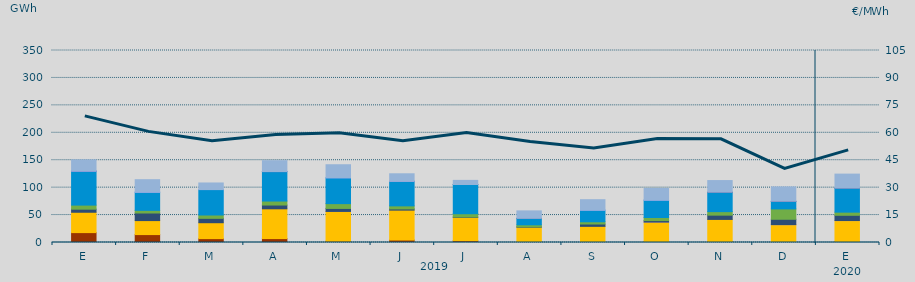
| Category | Carbón | Ciclo Combinado | Cogeneración | Consumo Bombeo | Eólica | Hidráulica | Nuclear | Otras Renovables | Turbinación bombeo |
|---|---|---|---|---|---|---|---|---|---|
| E | 18038.9 | 37091.8 | 0 | 5584.1 | 7459.5 | 61806.6 | 125.1 | 3.8 | 20506.3 |
| F | 14436.3 | 25499.5 | 0 | 13820.1 | 4854.6 | 33013.5 | 0 | 95.8 | 22781.5 |
| M | 7069 | 28989.6 | 0 | 7976 | 6086 | 46385.5 | 0 | 4 | 12004.9 |
| A | 7133.3 | 54294.6 | 0 | 6877.3 | 7238.7 | 53741.4 | 18.8 | 1.7 | 19863.3 |
| M | 2251.7 | 54358.5 | 20 | 5480.5 | 8758.9 | 47108.2 | 0 | 17.2 | 23767.4 |
| J | 4465.4 | 54530.5 | 0 | 2188.8 | 5586 | 44612.2 | 174.7 | 1.4 | 13701.1 |
| J | 3289.6 | 42570.7 | 0 | 636.6 | 5909.9 | 53272.1 | 42.5 | 0 | 7519.8 |
| A | 446.5 | 27502.9 | 0 | 624.2 | 3670.3 | 11750 | 1 | 0 | 13635.5 |
| S | 460.6 | 28967.7 | 0 | 4234.7 | 4105.5 | 21199.2 | 0 | 2.6 | 19063.6 |
| O | 1718.2 | 35506.1 | 18 | 2744.7 | 5556.7 | 31702.3 | 0 | 0.8 | 21165.2 |
| N | 1857.3 | 40203.9 | 0 | 7774.6 | 6415.7 | 35320.4 | 90 | 0 | 21237.9 |
| D | 554 | 31978.8 | 44.6 | 9751.3 | 18898.5 | 13540.8 | 366.6 | 0 | 26259.7 |
| E | 1376.4 | 38547.2 | 103.6 | 9542.6 | 5736.2 | 43797.8 | 0.3 | 0 | 25589.5 |